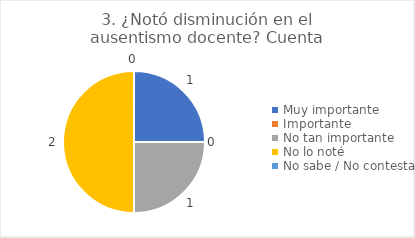
| Category | 3. ¿Notó disminución en el ausentismo docente? |
|---|---|
| Muy importante  | 0.25 |
| Importante  | 0 |
| No tan importante  | 0.25 |
| No lo noté  | 0.5 |
| No sabe / No contesta | 0 |